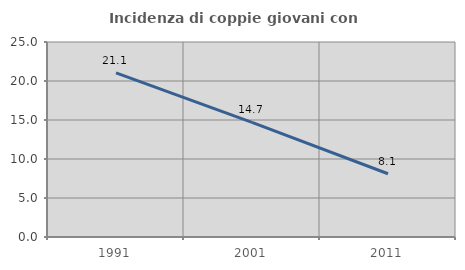
| Category | Incidenza di coppie giovani con figli |
|---|---|
| 1991.0 | 21.053 |
| 2001.0 | 14.706 |
| 2011.0 | 8.108 |